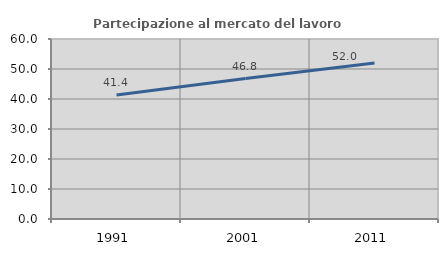
| Category | Partecipazione al mercato del lavoro  femminile |
|---|---|
| 1991.0 | 41.354 |
| 2001.0 | 46.825 |
| 2011.0 | 51.986 |